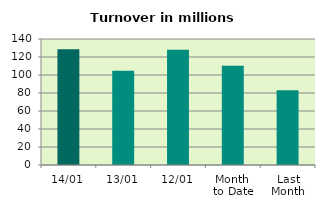
| Category | Series 0 |
|---|---|
| 14/01 | 128.547 |
| 13/01 | 104.747 |
| 12/01 | 128.002 |
| Month 
to Date | 110.165 |
| Last
Month | 83.19 |